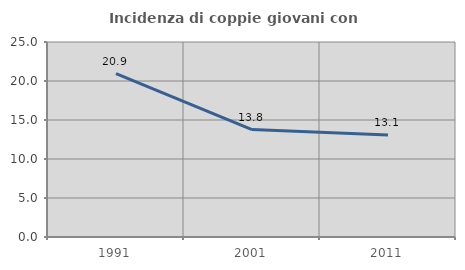
| Category | Incidenza di coppie giovani con figli |
|---|---|
| 1991.0 | 20.94 |
| 2001.0 | 13.769 |
| 2011.0 | 13.088 |